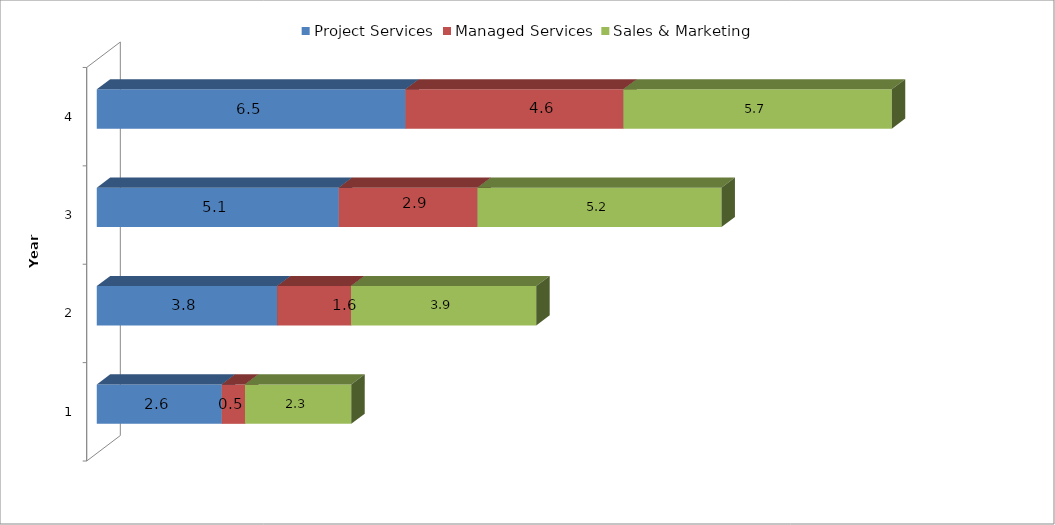
| Category | Project Services | Managed Services | Sales & Marketing |
|---|---|---|---|
| 1.0 | 2.647 | 0.492 | 2.25 |
| 2.0 | 3.821 | 1.563 | 3.922 |
| 3.0 | 5.126 | 2.937 | 5.167 |
| 4.0 | 6.538 | 4.613 | 5.684 |